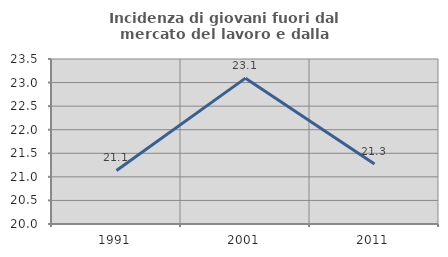
| Category | Incidenza di giovani fuori dal mercato del lavoro e dalla formazione  |
|---|---|
| 1991.0 | 21.137 |
| 2001.0 | 23.094 |
| 2011.0 | 21.272 |